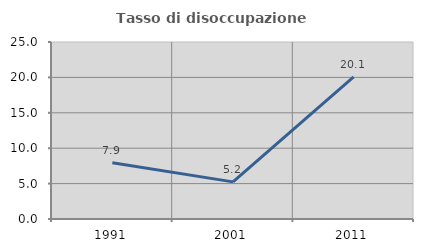
| Category | Tasso di disoccupazione giovanile  |
|---|---|
| 1991.0 | 7.943 |
| 2001.0 | 5.246 |
| 2011.0 | 20.084 |